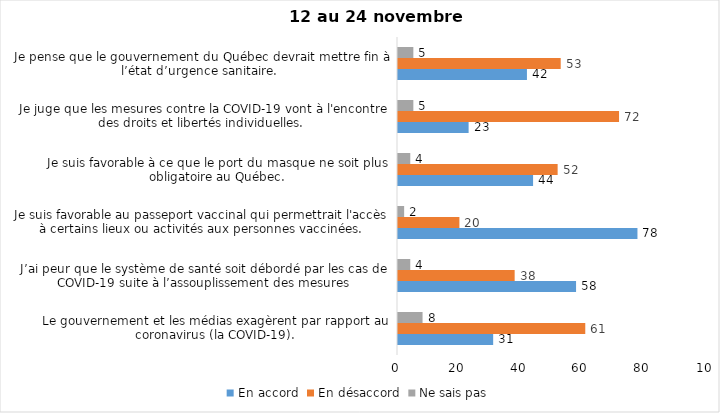
| Category | En accord | En désaccord | Ne sais pas |
|---|---|---|---|
| Le gouvernement et les médias exagèrent par rapport au coronavirus (la COVID-19). | 31 | 61 | 8 |
| J’ai peur que le système de santé soit débordé par les cas de COVID-19 suite à l’assouplissement des mesures | 58 | 38 | 4 |
| Je suis favorable au passeport vaccinal qui permettrait l'accès à certains lieux ou activités aux personnes vaccinées. | 78 | 20 | 2 |
| Je suis favorable à ce que le port du masque ne soit plus obligatoire au Québec. | 44 | 52 | 4 |
| Je juge que les mesures contre la COVID-19 vont à l'encontre des droits et libertés individuelles.  | 23 | 72 | 5 |
| Je pense que le gouvernement du Québec devrait mettre fin à l’état d’urgence sanitaire.  | 42 | 53 | 5 |